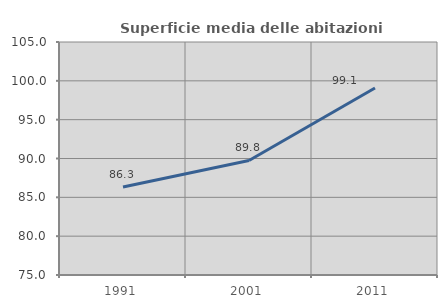
| Category | Superficie media delle abitazioni occupate |
|---|---|
| 1991.0 | 86.337 |
| 2001.0 | 89.75 |
| 2011.0 | 99.07 |